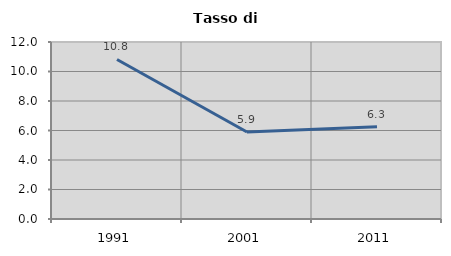
| Category | Tasso di disoccupazione   |
|---|---|
| 1991.0 | 10.816 |
| 2001.0 | 5.902 |
| 2011.0 | 6.25 |